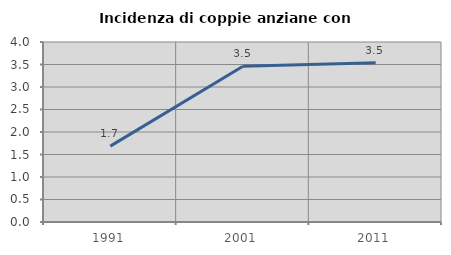
| Category | Incidenza di coppie anziane con figli |
|---|---|
| 1991.0 | 1.686 |
| 2001.0 | 3.459 |
| 2011.0 | 3.54 |